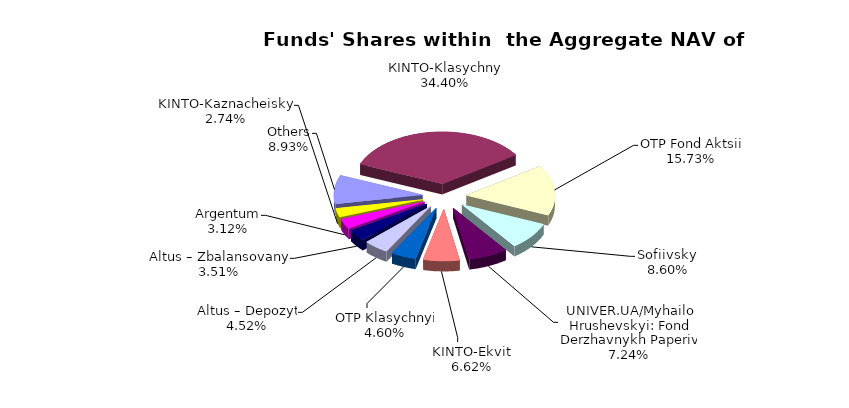
| Category | Series 0 | Series 1 |
|---|---|---|
| Others | 7765948.47 | 0.089 |
| КІNТО-Klasychnyi | 29925840.08 | 0.344 |
| ОТP Fond Aktsii | 13679670.49 | 0.157 |
| Sofiivskyi | 7478843.242 | 0.086 |
| UNIVER.UA/Myhailo Hrushevskyi: Fond Derzhavnykh Paperiv | 6300557.26 | 0.072 |
| KINTO-Ekviti | 5756694.96 | 0.066 |
| ОТP Klasychnyi | 3998427.33 | 0.046 |
| Altus – Depozyt | 3927745.71 | 0.045 |
| Altus – Zbalansovanyi | 3053708.86 | 0.035 |
| Аrgentum | 2713454.04 | 0.031 |
| KINTO-Kaznacheiskyi | 2380843.849 | 0.027 |